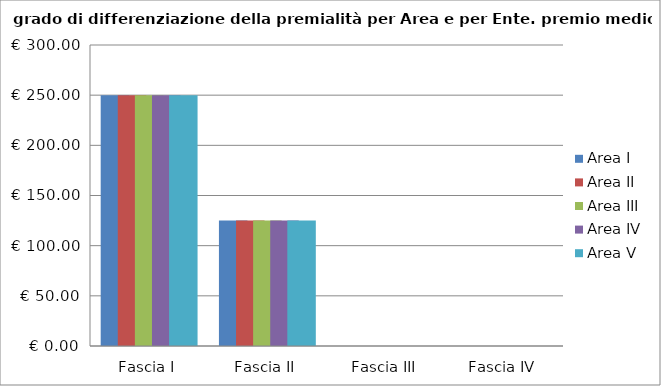
| Category | Area I | Area II | Area III | Area IV | Area V |
|---|---|---|---|---|---|
| Fascia I | 250 | 250 | 250 | 250 | 250 |
| Fascia II | 125 | 125 | 125 | 125 | 125 |
| Fascia III | 0 | 0 | 0 | 0 | 0 |
| Fascia IV | 0 | 0 | 0 | 0 | 0 |